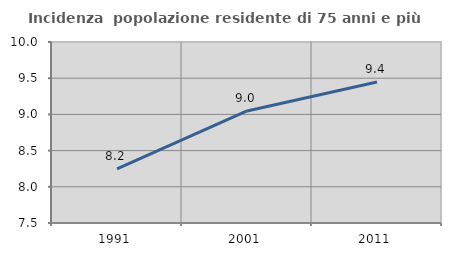
| Category | Incidenza  popolazione residente di 75 anni e più |
|---|---|
| 1991.0 | 8.246 |
| 2001.0 | 9.047 |
| 2011.0 | 9.446 |